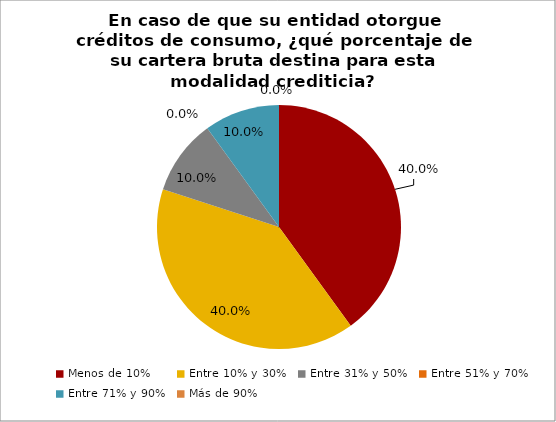
| Category | Series 0 |
|---|---|
| Menos de 10% | 0.4 |
| Entre 10% y 30% | 0.4 |
| Entre 31% y 50% | 0.1 |
| Entre 51% y 70% | 0 |
| Entre 71% y 90% | 0.1 |
| Más de 90% | 0 |